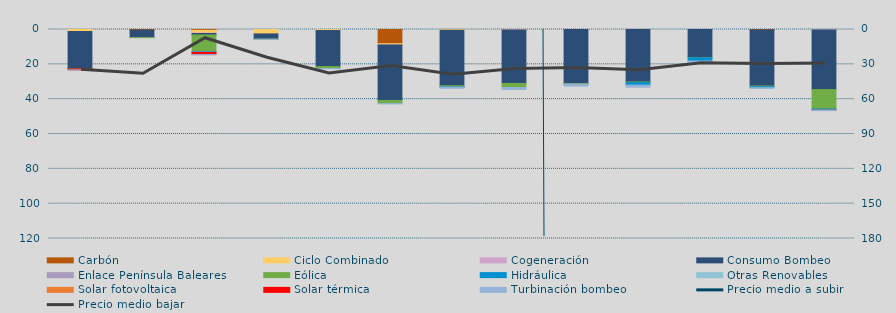
| Category | Carbón | Ciclo Combinado | Cogeneración | Consumo Bombeo | Enlace Península Baleares | Eólica | Hidráulica | Otras Renovables | Solar fotovoltaica | Solar térmica | Turbinación bombeo |
|---|---|---|---|---|---|---|---|---|---|---|---|
| 0 | 0 | 1097.9 | 0 | 21404.4 | 0 | 137.4 | 0 | 0 | 0 | 518.8 | 108.8 |
| 1 | 294.2 | 0 | 0 | 4310.8 | 42.4 | 0.6 | 0 | 0 | 0 | 0 | 0 |
| 2 | 516.7 | 1537.9 | 257 | 809.6 | 0 | 9502.9 | 408.7 | 117.5 | 0.4 | 1254.7 | 102.9 |
| 3 | 0 | 2533.1 | 0 | 2991.4 | 0 | 42.6 | 0 | 0 | 0 | 0 | 65 |
| 4 | 0 | 555.8 | 0 | 20748.5 | 0 | 1071 | 8.2 | 0 | 0 | 0 | 183.2 |
| 5 | 8149.5 | 754.8 | 3.5 | 31856.3 | 0 | 1760.6 | 0 | 0 | 0 | 0 | 177.8 |
| 6 | 0 | 458.3 | 0 | 31829.7 | 0 | 671.7 | 189.5 | 0 | 0 | 0 | 613.5 |
| 7 | 0 | 223.8 | 2.4 | 30752.2 | 0 | 2324.3 | 0 | 0 | 0 | 0 | 1135.9 |
| 8 | 0 | 0 | 0 | 31097.5 | 0 | 268.5 | 0 | 0 | 0 | 0 | 1121.8 |
| 9 | 0 | 20 | 0 | 30123.6 | 0 | 373.8 | 1416.6 | 0 | 0 | 0 | 1190.9 |
| 10 | 0 | 0 | 0 | 16053.6 | 0 | 185.3 | 1837.6 | 0 | 0 | 0 | 606.6 |
| 11 | 350.4 | 0 | 0 | 32084.5 | 0 | 425.7 | 531.2 | 0 | 0 | 0 | 413.1 |
| 12 | 0 | 90 | 154.4 | 34261.7 | 0 | 11163.7 | 589.5 | 122.2 | 0 | 44.1 | 171.5 |